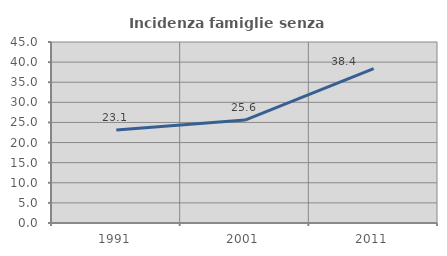
| Category | Incidenza famiglie senza nuclei |
|---|---|
| 1991.0 | 23.123 |
| 2001.0 | 25.596 |
| 2011.0 | 38.367 |